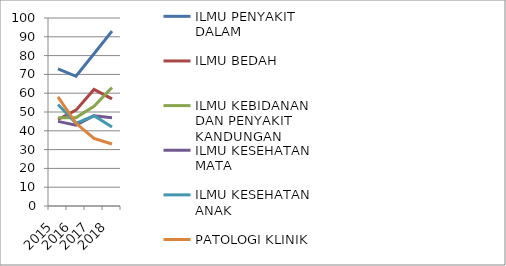
| Category | ILMU PENYAKIT DALAM | ILMU BEDAH | ILMU KEBIDANAN DAN PENYAKIT KANDUNGAN | ILMU KESEHATAN MATA | ILMU KESEHATAN ANAK | PATOLOGI KLINIK |
|---|---|---|---|---|---|---|
| 2015 | 73 | 46 | 47 | 45 | 54 | 58 |
| 2016 | 69 | 51 | 47 | 43 | 44 | 44 |
| 2017 | 81 | 62 | 53 | 48 | 48 | 36 |
| 2018 | 93 | 57 | 63 | 47 | 42 | 33 |